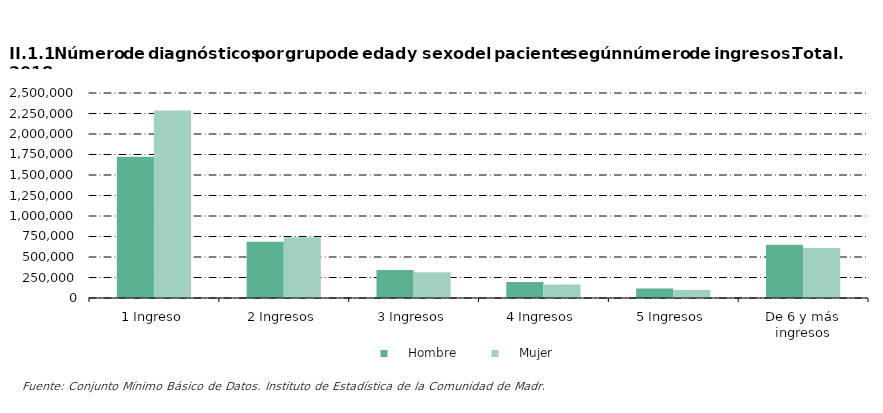
| Category |     Hombre |     Mujer |
|---|---|---|
| 1 Ingreso | 1722230 | 2286844 |
| 2 Ingresos | 685318 | 739830 |
| 3 Ingresos | 342712 | 314729 |
| 4 Ingresos | 196489 | 164372 |
| 5 Ingresos | 115477 | 98932 |
| De 6 y más ingresos | 649387 | 608807 |